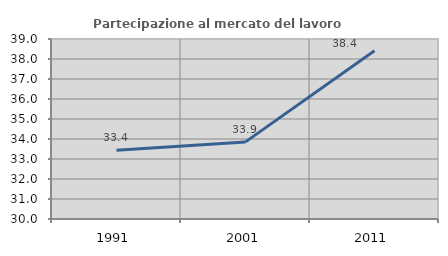
| Category | Partecipazione al mercato del lavoro  femminile |
|---|---|
| 1991.0 | 33.435 |
| 2001.0 | 33.855 |
| 2011.0 | 38.41 |